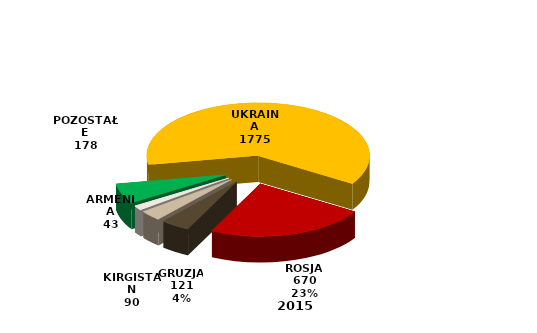
| Category | Series 0 |
|---|---|
| UKRAINA | 1775 |
| ROSJA | 670 |
| GRUZJA | 121 |
| KIRGISTAN | 90 |
| ARMENIA | 43 |
| POZOSTAŁE | 178 |